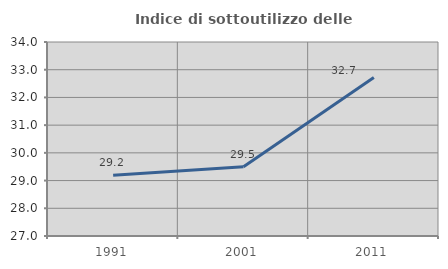
| Category | Indice di sottoutilizzo delle abitazioni  |
|---|---|
| 1991.0 | 29.195 |
| 2001.0 | 29.502 |
| 2011.0 | 32.719 |